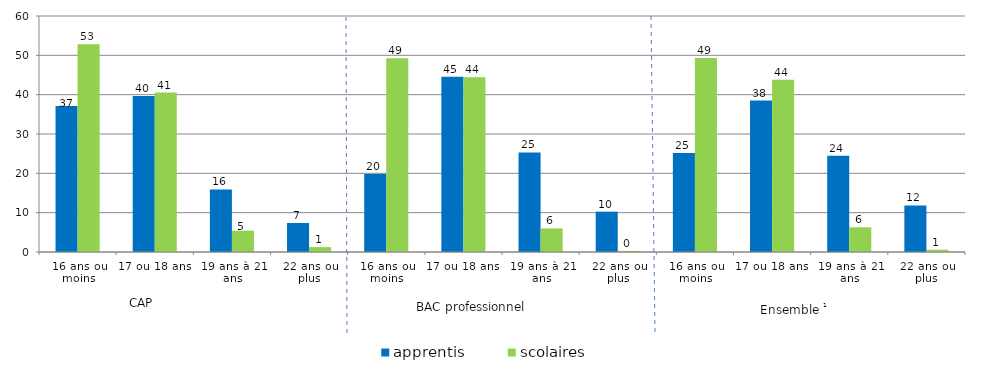
| Category | apprentis | scolaires |
|---|---|---|
| 16 ans ou moins | 37.1 | 52.809 |
| 17 ou 18 ans | 39.64 | 40.531 |
| 19 ans à 21 ans | 15.89 | 5.418 |
| 22 ans ou plus | 7.38 | 1.242 |
| 16 ans ou moins | 19.86 | 49.282 |
| 17 ou 18 ans | 44.55 | 44.444 |
| 19 ans à 21 ans | 25.32 | 5.995 |
| 22 ans ou plus | 10.26 | 0.279 |
| 16 ans ou moins | 25.2 | 49.349 |
| 17 ou 18 ans | 38.49 | 43.797 |
| 19 ans à 21 ans | 24.47 | 6.271 |
| 22 ans ou plus | 11.84 | 0.583 |